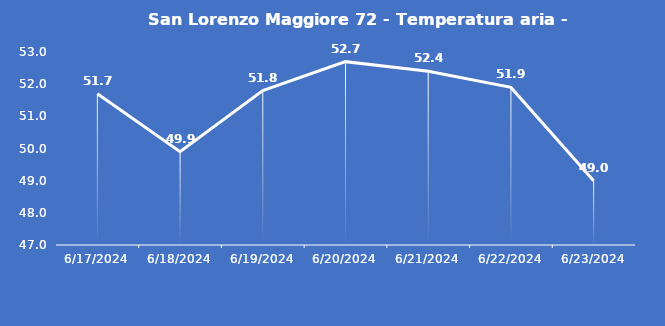
| Category | San Lorenzo Maggiore 72 - Temperatura aria - Grezzo (°C) |
|---|---|
| 6/17/24 | 51.7 |
| 6/18/24 | 49.9 |
| 6/19/24 | 51.8 |
| 6/20/24 | 52.7 |
| 6/21/24 | 52.4 |
| 6/22/24 | 51.9 |
| 6/23/24 | 49 |